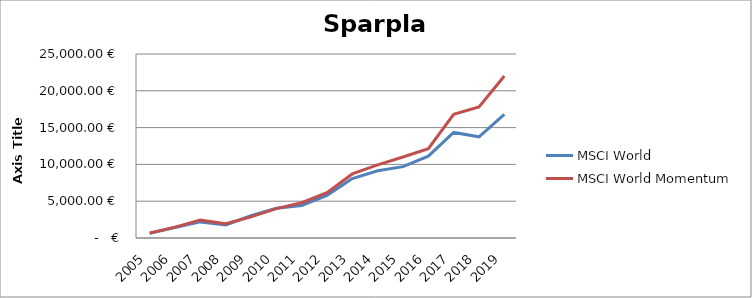
| Category | MSCI World |  MSCI World Momentum  |
|---|---|---|
| 2005.0 | 630.06 | 685.05 |
| 2006.0 | 1422.117 | 1472.899 |
| 2007.0 | 2186.924 | 2425.883 |
| 2008.0 | 1783.948 | 1937.711 |
| 2009.0 | 3025.595 | 2867.997 |
| 2010.0 | 4035.973 | 3991.983 |
| 2011.0 | 4418.308 | 4797.569 |
| 2012.0 | 5798.716 | 6151.5 |
| 2013.0 | 8067.934 | 8705.014 |
| 2014.0 | 9128.171 | 9938.067 |
| 2015.0 | 9698 | 11002.875 |
| 2016.0 | 11112.837 | 12139.761 |
| 2017.0 | 14345.779 | 16793.88 |
| 2018.0 | 13744.825 | 17800.714 |
| 2019.0 | 16785.816 | 22017.237 |